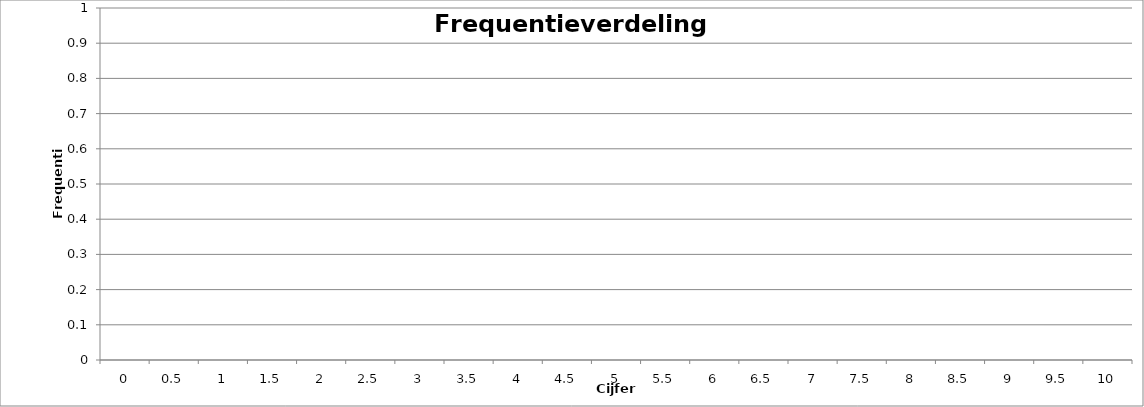
| Category | Series 1 |
|---|---|
| 0.0 | 0 |
| 0.5 | 0 |
| 1.0 | 0 |
| 1.5 | 0 |
| 2.0 | 0 |
| 2.5 | 0 |
| 3.0 | 0 |
| 3.5 | 0 |
| 4.0 | 0 |
| 4.5 | 0 |
| 5.0 | 0 |
| 5.5 | 0 |
| 6.0 | 0 |
| 6.5 | 0 |
| 7.0 | 0 |
| 7.5 | 0 |
| 8.0 | 0 |
| 8.5 | 0 |
| 9.0 | 0 |
| 9.5 | 0 |
| 10.0 | 0 |